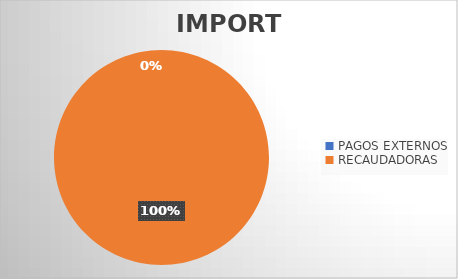
| Category | IMPORTE |
|---|---|
| PAGOS EXTERNOS | 55204.3 |
| RECAUDADORAS | 1851085880.23 |